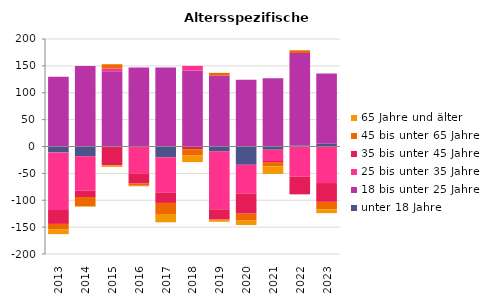
| Category | unter 18 Jahre | 18 bis unter 25 Jahre | 25 bis unter 35 Jahre | 35 bis unter 45 Jahre | 45 bis unter 65 Jahre | 65 Jahre und älter |
|---|---|---|---|---|---|---|
| 2013.0 | -11 | 130 | -107 | -26 | -10 | -9 |
| 2014.0 | -18 | 150 | -64 | -12 | -17 | -1 |
| 2015.0 | -1 | 140 | 5 | -34 | 8 | -3 |
| 2016.0 | 1 | 146 | -50 | -19 | -4 | -1 |
| 2017.0 | -20 | 147 | -66 | -19 | -22 | -14 |
| 2018.0 | 1 | 140 | 9 | -5 | -12 | -12 |
| 2019.0 | -9 | 132 | -108 | -19 | 5 | -4 |
| 2020.0 | -34 | 124 | -54 | -37 | -13 | -8 |
| 2021.0 | -6 | 127 | -21 | -2 | -8 | -14 |
| 2022.0 | 2 | 172 | -56 | -33 | 5 | 0 |
| 2023.0 | 5 | 131 | -68 | -35 | -14 | -7 |